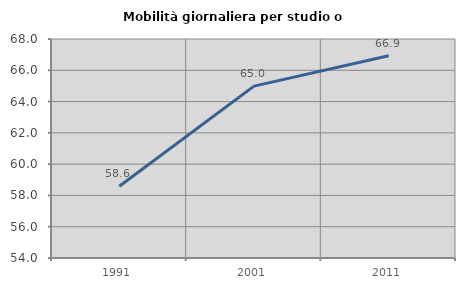
| Category | Mobilità giornaliera per studio o lavoro |
|---|---|
| 1991.0 | 58.583 |
| 2001.0 | 64.988 |
| 2011.0 | 66.925 |